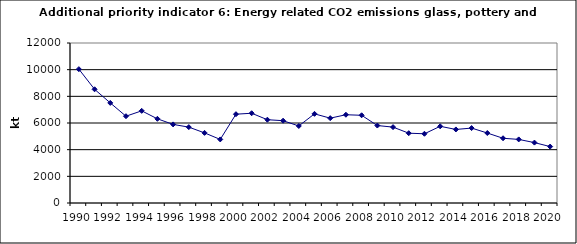
| Category | Energy related CO2 emissions from glass, pottery and building materials, kt |
|---|---|
| 1990 | 10038.445 |
| 1991 | 8528.305 |
| 1992 | 7506.565 |
| 1993 | 6509.703 |
| 1994 | 6912.553 |
| 1995 | 6313.493 |
| 1996 | 5895.583 |
| 1997 | 5690.179 |
| 1998 | 5258.27 |
| 1999 | 4768.122 |
| 2000 | 6660.281 |
| 2001 | 6732.329 |
| 2002 | 6247.207 |
| 2003 | 6173.363 |
| 2004 | 5776.253 |
| 2005 | 6686.152 |
| 2006 | 6362.722 |
| 2007 | 6619.057 |
| 2008 | 6578.172 |
| 2009 | 5810.014 |
| 2010 | 5691.409 |
| 2011 | 5235.214 |
| 2012 | 5192.536 |
| 2013 | 5751.681 |
| 2014 | 5516.665 |
| 2015 | 5618.451 |
| 2016 | 5248.004 |
| 2017 | 4855.095 |
| 2018 | 4768.673 |
| 2019 | 4529.966 |
| 2020 | 4230.598 |